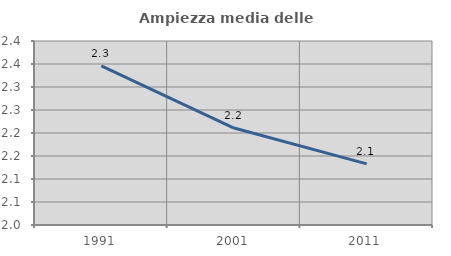
| Category | Ampiezza media delle famiglie |
|---|---|
| 1991.0 | 2.346 |
| 2001.0 | 2.211 |
| 2011.0 | 2.133 |